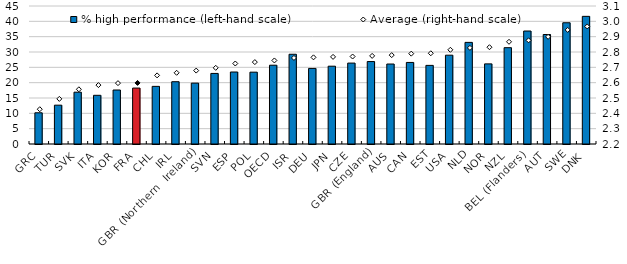
| Category | % high performance (left-hand scale) |
|---|---|
| GRC | 10.175 |
| TUR | 12.662 |
| SVK | 16.898 |
| ITA | 15.876 |
| KOR | 17.606 |
| FRA | 18.238 |
| CHL | 18.796 |
| IRL | 20.31 |
| GBR (Northern  Ireland) | 19.849 |
| SVN | 23.012 |
| ESP | 23.474 |
| POL | 23.425 |
| OECD | 25.692 |
| ISR | 29.262 |
| DEU | 24.648 |
| JPN | 25.373 |
| CZE | 26.383 |
| GBR (England) | 26.887 |
| AUS | 26.077 |
| CAN | 26.593 |
| EST | 25.634 |
| USA | 28.962 |
| NLD | 33.138 |
| NOR | 26.124 |
| NZL | 31.407 |
| BEL (Flanders) | 36.841 |
| AUT | 35.704 |
| SWE | 39.535 |
| DNK | 41.622 |